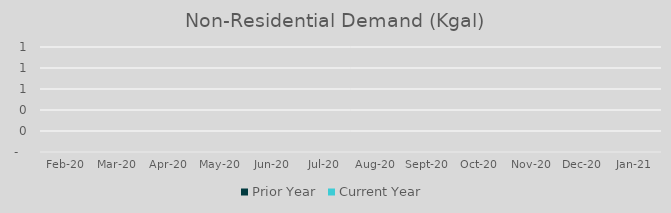
| Category | Prior Year | Current Year |
|---|---|---|
| 2020-02-01 | 0 | 0 |
| 2020-03-01 | 0 | 0 |
| 2020-04-01 | 0 | 0 |
| 2020-05-01 | 0 | 0 |
| 2020-06-01 | 0 | 0 |
| 2020-07-01 | 0 | 0 |
| 2020-08-01 | 0 | 0 |
| 2020-09-01 | 0 | 0 |
| 2020-10-01 | 0 | 0 |
| 2020-11-01 | 0 | 0 |
| 2020-12-01 | 0 | 0 |
| 2021-01-01 | 0 | 0 |